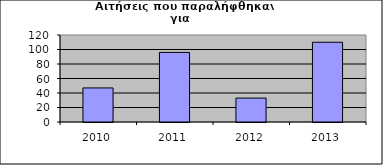
| Category | Series 0 |
|---|---|
| 2010.0 | 47 |
| 2011.0 | 96 |
| 2012.0 | 33 |
| 2013.0 | 110 |